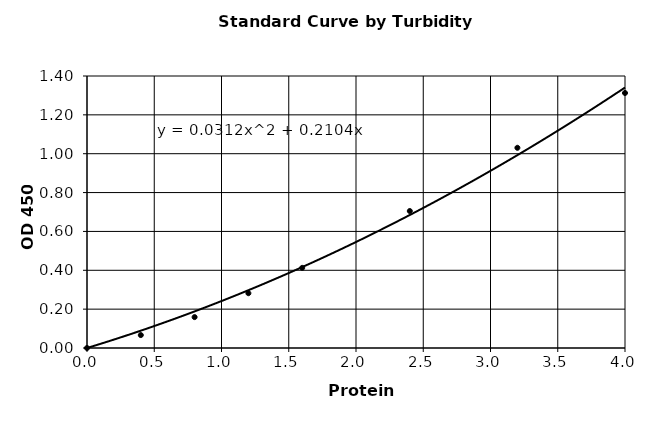
| Category | Series 0 |
|---|---|
| 0.0 | 0 |
| 0.4 | 0.066 |
| 0.8 | 0.159 |
| 1.2 | 0.282 |
| 1.6 | 0.413 |
| 2.4 | 0.705 |
| 3.2 | 1.031 |
| 4.0 | 1.313 |